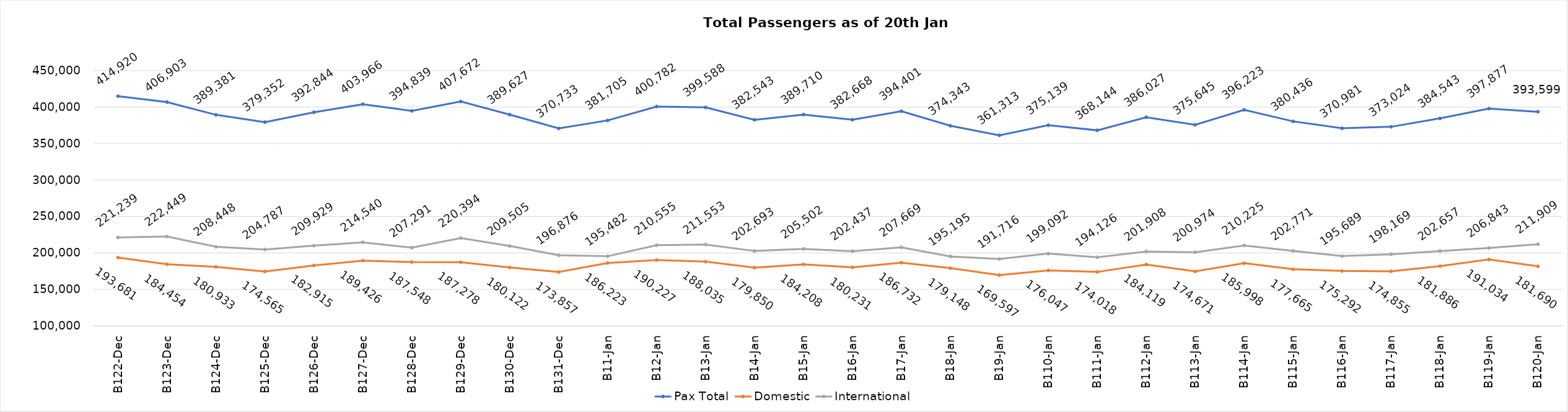
| Category | Pax Total | Domestic | International |
|---|---|---|---|
| 2023-12-22 | 414920 | 193681 | 221239 |
| 2023-12-23 | 406903 | 184454 | 222449 |
| 2023-12-24 | 389381 | 180933 | 208448 |
| 2023-12-25 | 379352 | 174565 | 204787 |
| 2023-12-26 | 392844 | 182915 | 209929 |
| 2023-12-27 | 403966 | 189426 | 214540 |
| 2023-12-28 | 394839 | 187548 | 207291 |
| 2023-12-29 | 407672 | 187278 | 220394 |
| 2023-12-30 | 389627 | 180122 | 209505 |
| 2023-12-31 | 370733 | 173857 | 196876 |
| 2024-01-01 | 381705 | 186223 | 195482 |
| 2024-01-02 | 400782 | 190227 | 210555 |
| 2024-01-03 | 399588 | 188035 | 211553 |
| 2024-01-04 | 382543 | 179850 | 202693 |
| 2024-01-05 | 389710 | 184208 | 205502 |
| 2024-01-06 | 382668 | 180231 | 202437 |
| 2024-01-07 | 394401 | 186732 | 207669 |
| 2024-01-08 | 374343 | 179148 | 195195 |
| 2024-01-09 | 361313 | 169597 | 191716 |
| 2024-01-10 | 375139 | 176047 | 199092 |
| 2024-01-11 | 368144 | 174018 | 194126 |
| 2024-01-12 | 386027 | 184119 | 201908 |
| 2024-01-13 | 375645 | 174671 | 200974 |
| 2024-01-14 | 396223 | 185998 | 210225 |
| 2024-01-15 | 380436 | 177665 | 202771 |
| 2024-01-16 | 370981 | 175292 | 195689 |
| 2024-01-17 | 373024 | 174855 | 198169 |
| 2024-01-18 | 384543 | 181886 | 202657 |
| 2024-01-19 | 397877 | 191034 | 206843 |
| 2024-01-20 | 393599 | 181690 | 211909 |